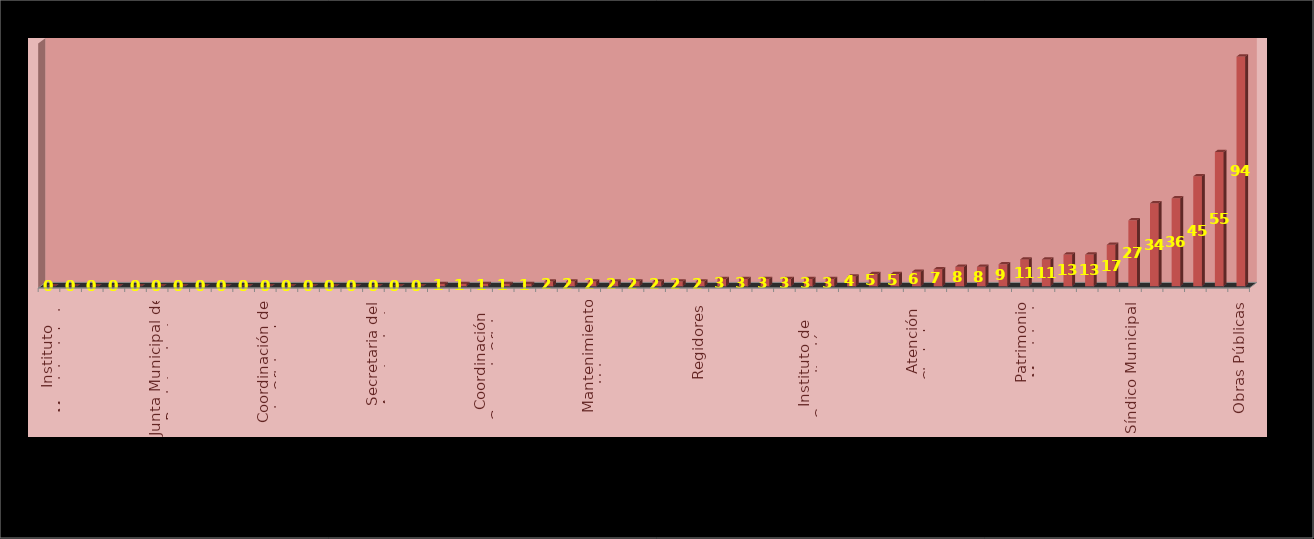
| Category | Series 0 | Series 1 |
|---|---|---|
| Instituto Municipal de la Juventud |  | 0 |
| Instituto Municipal de la Mujer |  | 0 |
| Sanidad Animal |  | 0 |
| Vinculación Asuntos Religiosos |  | 0 |
| Dirección de Protección al Medio Ambiente |  | 0 |
| Junta Municipal de Reclutamiento |  | 0 |
| Rastros Municipales |  | 0 |
| Relaciones Exteriores |  | 0 |
| Relaciones Públicas |  | 0 |
| Consejería Jurídica |  | 0 |
| Coordinación de la Oficina de Presidencia  |  | 0 |
| Coplademun |  | 0 |
| Dirección de Parques y Jardines |  | 0 |
| Dirección de Cementerios |  | 0 |
| Mantenimiento de Pavimentos |  | 0 |
| Secretaria del Ayuntamiento |  | 0 |
| Dir. Gral. Innovación y Tecnología |  | 0 |
| Estacionómetros y Estacionamientos |  | 0 |
| Educación Municipal |  | 1 |
| Comunidad Digna |  | 1 |
| Coordinación General  Oficina Central de Gobierno, Estrategía y opinión Pública |  | 1 |
| Coordinación de Delegaciones |  | 1 |
| Alumbrado Público |  | 1 |
| Coordinación de Gabinete |  | 2 |
| Dirección de Aseo Público |  | 2 |
| Mantenimiento Urbano |  | 2 |
| Agua y Alcantarillado |  | 2 |
| Asuntos Internos |  | 2 |
| Registro Civil |  | 2 |
| Secretaría Particular |  | 2 |
| Regidores |  | 2 |
| Comunicación Social |  | 3 |
| Proyectos Estratégicos |  | 3 |
| Integración y Dictaminación |  | 3 |
| Dir. Gral. Promoción Económica y T. |  | 3 |
| Instituto de Capacitación y Oferta Educativa |  | 3 |
| Dirección Catastro |  | 3 |
| Contraloría |  | 4 |
| Dirección de Transparencia y Acceso a la Información |  | 5 |
| Protección Civil y Bomberos |  | 5 |
| Atención Ciudadana |  | 6 |
| Dir. Gral. de Servicios Públicos |  | 7 |
| Instituto de Cultura |  | 8 |
| Actas y Acuerdos |  | 8 |
| Participación Ciudadana |  | 9 |
| Patrimonio Municipal |  | 11 |
| Archivo Municipal |  | 11 |
| Dir. General y Admva. Ecología |  | 13 |
| Desarrollo Social Humano |  | 13 |
| Seguridad Pública |  | 17 |
| Síndico Municipal |  | 27 |
| Inspección de Reglamentos |  | 34 |
| Padrón y Licencias |  | 36 |
| Tesorero Municipal |  | 45 |
| Oficialía Mayor Administrativa |  | 55 |
| Obras Públicas |  | 94 |